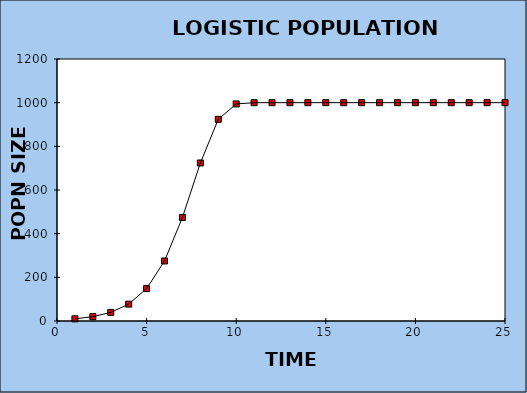
| Category | Series 0 |
|---|---|
| 1.0 | 10 |
| 2.0 | 19.9 |
| 3.0 | 39.404 |
| 4.0 | 77.255 |
| 5.0 | 148.542 |
| 6.0 | 275.02 |
| 7.0 | 474.404 |
| 8.0 | 723.748 |
| 9.0 | 923.685 |
| 10.0 | 994.176 |
| 11.0 | 999.966 |
| 12.0 | 1000 |
| 13.0 | 1000 |
| 14.0 | 1000 |
| 15.0 | 1000 |
| 16.0 | 1000 |
| 17.0 | 1000 |
| 18.0 | 1000 |
| 19.0 | 1000 |
| 20.0 | 1000 |
| 21.0 | 1000 |
| 22.0 | 1000 |
| 23.0 | 1000 |
| 24.0 | 1000 |
| 25.0 | 1000 |